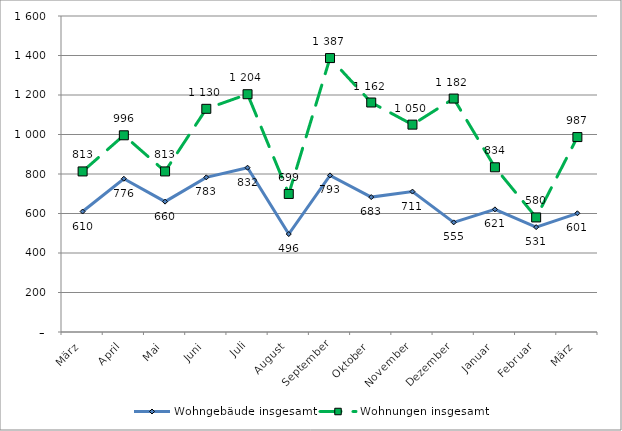
| Category | Wohngebäude insgesamt | Wohnungen insgesamt |
|---|---|---|
| März | 610 | 813 |
| April | 776 | 996 |
| Mai | 660 | 813 |
| Juni | 783 | 1130 |
| Juli | 832 | 1204 |
| August | 496 | 699 |
| September | 793 | 1387 |
| Oktober | 683 | 1162 |
| November | 711 | 1050 |
| Dezember | 555 | 1182 |
| Januar | 621 | 834 |
| Februar | 531 | 580 |
| März | 601 | 987 |